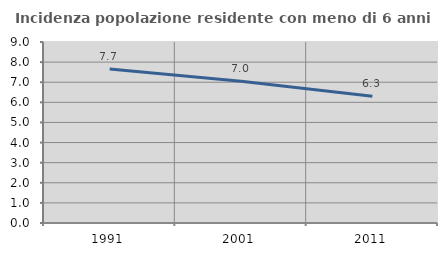
| Category | Incidenza popolazione residente con meno di 6 anni |
|---|---|
| 1991.0 | 7.66 |
| 2001.0 | 7.047 |
| 2011.0 | 6.3 |